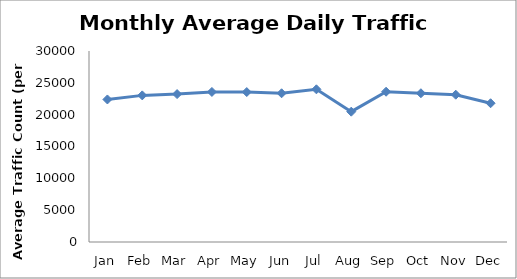
| Category | Series 0 |
|---|---|
| Jan | 22388.75 |
| Feb | 23028.75 |
| Mar | 23232.75 |
| Apr | 23568.5 |
| May | 23551.25 |
| Jun | 23360.75 |
| Jul | 23980.75 |
| Aug | 20470 |
| Sep | 23602 |
| Oct | 23364 |
| Nov | 23134.25 |
| Dec | 21794.5 |